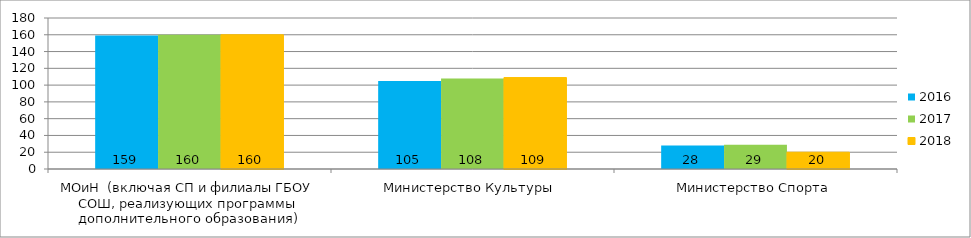
| Category | 2016 | 2017 | 2018 |
|---|---|---|---|
| МОиН  (включая СП и филиалы ГБОУ СОШ, реализующих программы дополнительного образования) | 159 | 160 | 160 |
| Министерство Культуры | 105 | 108 | 109 |
| Министерство Спорта | 28 | 29 | 20 |